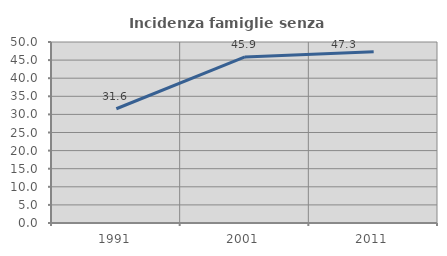
| Category | Incidenza famiglie senza nuclei |
|---|---|
| 1991.0 | 31.56 |
| 2001.0 | 45.872 |
| 2011.0 | 47.297 |